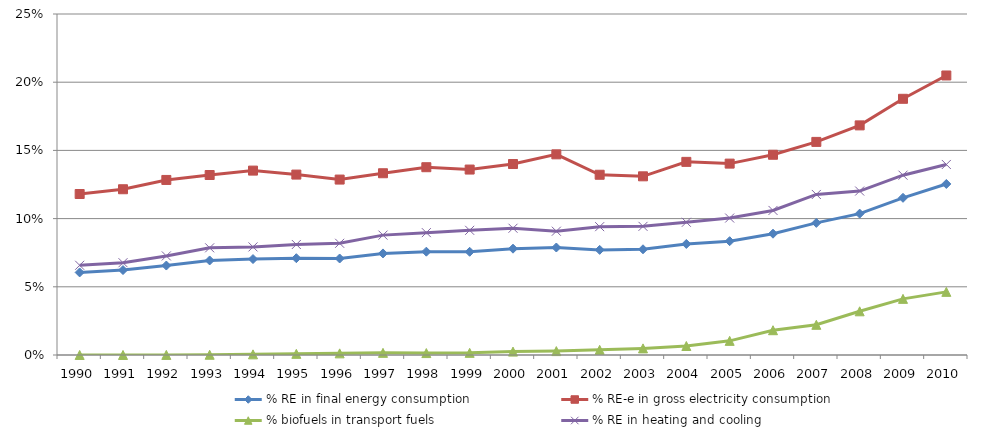
| Category | % RE in final energy consumption | % RE-e in gross electricity consumption | % biofuels in transport fuels | % RE in heating and cooling |
|---|---|---|---|---|
| 1990.0 | 0.061 | 0.118 | 0 | 0.066 |
| 1991.0 | 0.062 | 0.122 | 0 | 0.068 |
| 1992.0 | 0.066 | 0.128 | 0 | 0.073 |
| 1993.0 | 0.069 | 0.132 | 0 | 0.079 |
| 1994.0 | 0.07 | 0.135 | 0 | 0.079 |
| 1995.0 | 0.071 | 0.132 | 0.001 | 0.081 |
| 1996.0 | 0.071 | 0.129 | 0.001 | 0.082 |
| 1997.0 | 0.074 | 0.133 | 0.002 | 0.088 |
| 1998.0 | 0.076 | 0.138 | 0.001 | 0.09 |
| 1999.0 | 0.076 | 0.136 | 0.002 | 0.091 |
| 2000.0 | 0.078 | 0.14 | 0.002 | 0.093 |
| 2001.0 | 0.079 | 0.147 | 0.003 | 0.091 |
| 2002.0 | 0.077 | 0.132 | 0.004 | 0.094 |
| 2003.0 | 0.078 | 0.131 | 0.005 | 0.094 |
| 2004.0 | 0.081 | 0.142 | 0.007 | 0.097 |
| 2005.0 | 0.083 | 0.14 | 0.01 | 0.1 |
| 2006.0 | 0.089 | 0.147 | 0.018 | 0.106 |
| 2007.0 | 0.097 | 0.156 | 0.022 | 0.118 |
| 2008.0 | 0.104 | 0.168 | 0.032 | 0.12 |
| 2009.0 | 0.115 | 0.188 | 0.041 | 0.132 |
| 2010.0 | 0.125 | 0.205 | 0.046 | 0.14 |